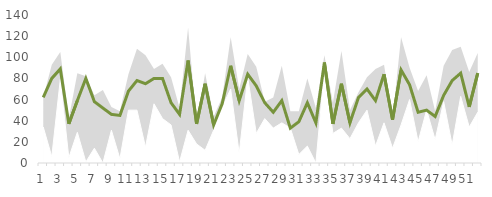
| Category | Average Customers |
|---|---|
| 0 | 62 |
| 1 | 80 |
| 2 | 89 |
| 3 | 37 |
| 4 | 59 |
| 5 | 80 |
| 6 | 58 |
| 7 | 52 |
| 8 | 46 |
| 9 | 45 |
| 10 | 68 |
| 11 | 78 |
| 12 | 75 |
| 13 | 80 |
| 14 | 80 |
| 15 | 57 |
| 16 | 46 |
| 17 | 97 |
| 18 | 37 |
| 19 | 75 |
| 20 | 36 |
| 21 | 56 |
| 22 | 92 |
| 23 | 59 |
| 24 | 84 |
| 25 | 73 |
| 26 | 57 |
| 27 | 48 |
| 28 | 59 |
| 29 | 33 |
| 30 | 39 |
| 31 | 57 |
| 32 | 38 |
| 33 | 95 |
| 34 | 37 |
| 35 | 75 |
| 36 | 38 |
| 37 | 62 |
| 38 | 70 |
| 39 | 59 |
| 40 | 84 |
| 41 | 41 |
| 42 | 88 |
| 43 | 74 |
| 44 | 48 |
| 45 | 50 |
| 46 | 44 |
| 47 | 64 |
| 48 | 78 |
| 49 | 85 |
| 50 | 53 |
| 51 | 85 |